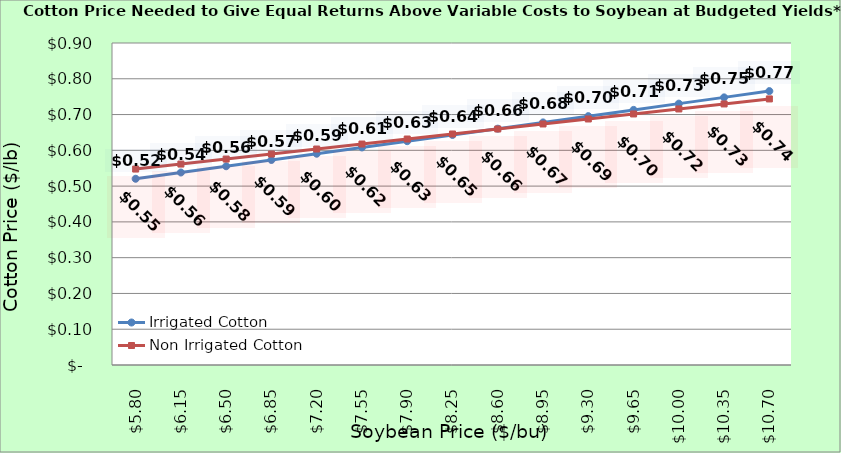
| Category | Irrigated Cotton | Non Irrigated Cotton |
|---|---|---|
| 5.8000000000000025 | 0.521 | 0.548 |
| 6.150000000000002 | 0.538 | 0.562 |
| 6.500000000000002 | 0.556 | 0.576 |
| 6.850000000000001 | 0.573 | 0.59 |
| 7.200000000000001 | 0.591 | 0.604 |
| 7.550000000000001 | 0.608 | 0.618 |
| 7.9 | 0.626 | 0.632 |
| 8.25 | 0.643 | 0.646 |
| 8.6 | 0.661 | 0.66 |
| 8.95 | 0.678 | 0.674 |
| 9.299999999999999 | 0.696 | 0.688 |
| 9.649999999999999 | 0.713 | 0.702 |
| 9.999999999999998 | 0.731 | 0.716 |
| 10.349999999999998 | 0.748 | 0.73 |
| 10.699999999999998 | 0.766 | 0.744 |